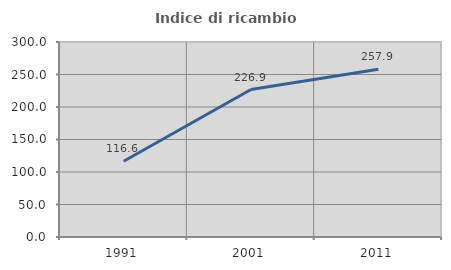
| Category | Indice di ricambio occupazionale  |
|---|---|
| 1991.0 | 116.578 |
| 2001.0 | 226.866 |
| 2011.0 | 257.923 |